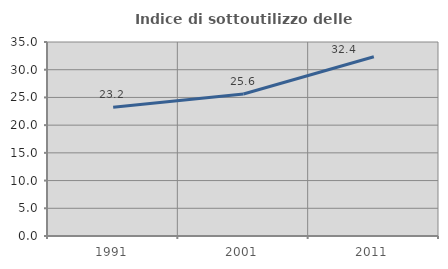
| Category | Indice di sottoutilizzo delle abitazioni  |
|---|---|
| 1991.0 | 23.213 |
| 2001.0 | 25.615 |
| 2011.0 | 32.35 |